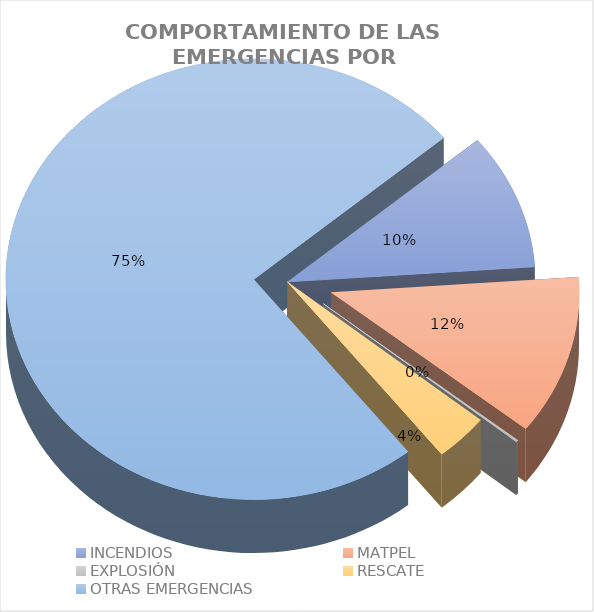
| Category | Series 0 |
|---|---|
| INCENDIOS | 0.1 |
| MATPEL | 0.117 |
| EXPLOSIÓN | 0.001 |
| RESCATE | 0.035 |
| OTRAS EMERGENCIAS | 0.746 |